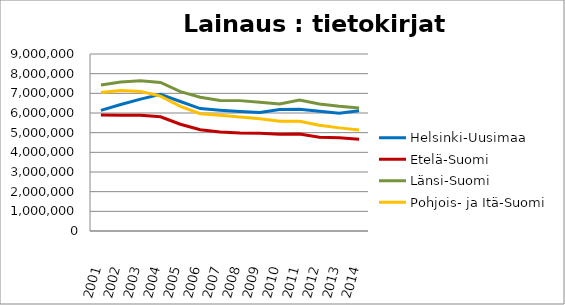
| Category | Helsinki-Uusimaa | Etelä-Suomi | Länsi-Suomi | Pohjois- ja Itä-Suomi |
|---|---|---|---|---|
| 2001.0 | 6133873 | 5900244 | 7428821 | 7039234 |
| 2002.0 | 6430207 | 5890521 | 7577857 | 7144787 |
| 2003.0 | 6706251 | 5891657 | 7638409 | 7087712 |
| 2004.0 | 6947926 | 5807555 | 7553444 | 6856496 |
| 2005.0 | 6583815 | 5429669 | 7083735 | 6337957 |
| 2006.0 | 6223230 | 5149889 | 6805195 | 5961485 |
| 2007.0 | 6142971 | 5036076 | 6639388 | 5886297 |
| 2008.0 | 6082170 | 4986810 | 6629257 | 5794115 |
| 2009.0 | 6020679 | 4971464 | 6550977 | 5706285 |
| 2010.0 | 6175853 | 4924494 | 6463180 | 5584490 |
| 2011.0 | 6184414 | 4927293 | 6665348 | 5576495 |
| 2012.0 | 6089098 | 4768217 | 6462532 | 5381576 |
| 2013.0 | 5985932 | 4740461 | 6344020 | 5243075 |
| 2014.0 | 6112396 | 4669031 | 6249645 | 5130698 |